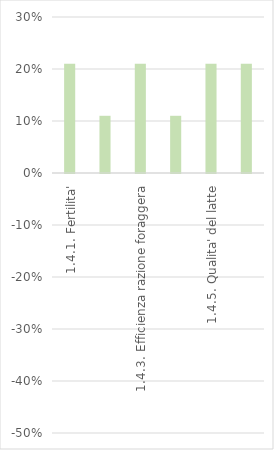
| Category | Series 0 |
|---|---|
| 1.4.1. Fertilita' | 0.21 |
| 1.4.2. Incremento ponderale giornaliero | 0.11 |
| 1.4.3. Efficienza razione foraggera | 0.21 |
| 1.4.4. Tasso di riforma involontaria | 0.11 |
| 1.4.5. Qualita' del latte | 0.21 |
| 1.4.6. Rapporto omega6/omega3 | 0.21 |